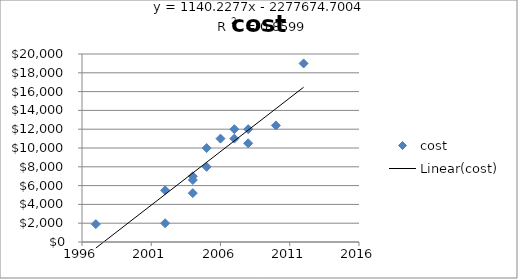
| Category | cost |
|---|---|
| 2005.0 | 7995 |
| 2007.0 | 10998 |
| 2002.0 | 1995 |
| 2006.0 | 10998 |
| 2008.0 | 10500 |
| 2012.0 | 18995 |
| 2004.0 | 6995 |
| 2004.0 | 6599 |
| 2002.0 | 5500 |
| 2010.0 | 12399 |
| 2004.0 | 5200 |
| 1997.0 | 1900 |
| 2007.0 | 11999 |
| 2008.0 | 12000 |
| 2005.0 | 9995 |